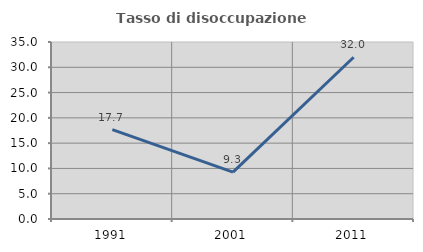
| Category | Tasso di disoccupazione giovanile  |
|---|---|
| 1991.0 | 17.687 |
| 2001.0 | 9.278 |
| 2011.0 | 31.982 |